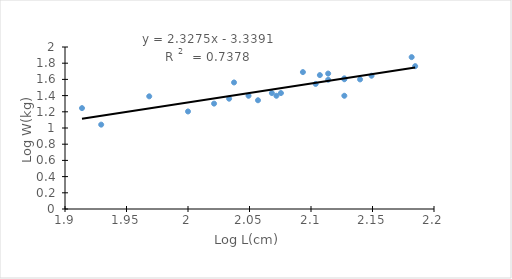
| Category | Series 0 |
|---|---|
| 1.9294189257142926 | 1.041 |
| 2.0 | 1.204 |
| 1.9138138523837167 | 1.246 |
| 2.021189299069938 | 1.301 |
| 2.0569048513364723 | 1.342 |
| 2.0334237554869494 | 1.362 |
| 1.968482948553935 | 1.391 |
| 2.1271047983648073 | 1.398 |
| 2.049218022670181 | 1.398 |
| 2.0718820073061255 | 1.398 |
| 2.0681858617461617 | 1.431 |
| 2.0755469613925306 | 1.431 |
| 2.103803720955957 | 1.544 |
| 2.0374264979406234 | 1.562 |
| 2.1139433523068365 | 1.595 |
| 2.1398790864012365 | 1.6 |
| 2.1271047983648073 | 1.602 |
| 2.1271047983648073 | 1.613 |
| 2.1492191126553797 | 1.645 |
| 2.107209969647868 | 1.653 |
| 2.1139433523068365 | 1.672 |
| 2.093421685162235 | 1.69 |
| 2.1846914308175984 | 1.763 |
| 2.181843587944772 | 1.875 |